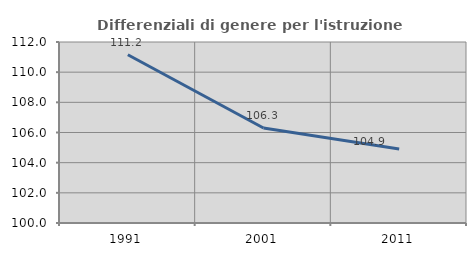
| Category | Differenziali di genere per l'istruzione superiore |
|---|---|
| 1991.0 | 111.152 |
| 2001.0 | 106.298 |
| 2011.0 | 104.91 |